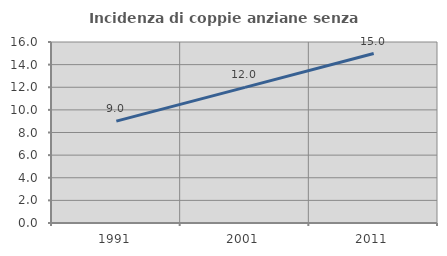
| Category | Incidenza di coppie anziane senza figli  |
|---|---|
| 1991.0 | 9.004 |
| 2001.0 | 11.985 |
| 2011.0 | 14.981 |